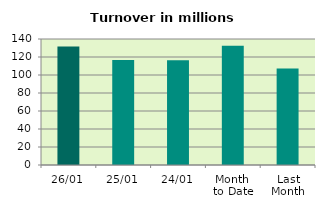
| Category | Series 0 |
|---|---|
| 26/01 | 131.802 |
| 25/01 | 116.649 |
| 24/01 | 116.252 |
| Month 
to Date | 132.394 |
| Last
Month | 107.094 |